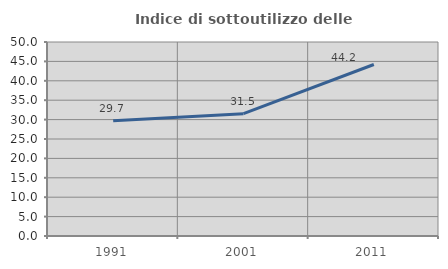
| Category | Indice di sottoutilizzo delle abitazioni  |
|---|---|
| 1991.0 | 29.699 |
| 2001.0 | 31.538 |
| 2011.0 | 44.206 |